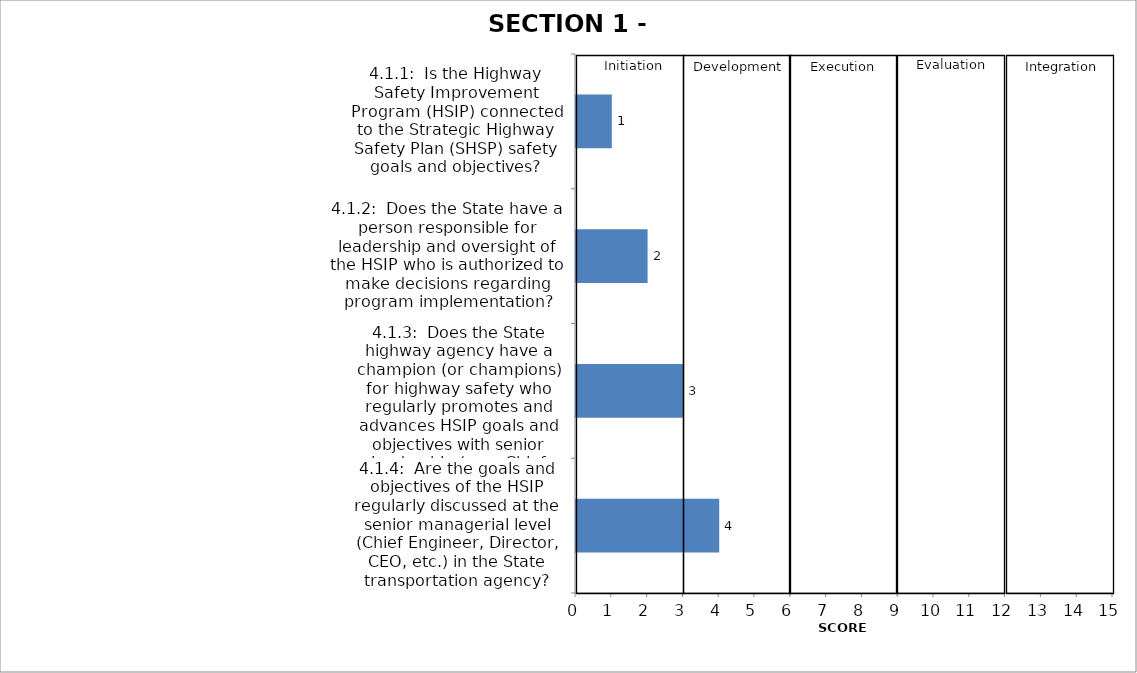
| Category | Series 0 |
|---|---|
| 4.1.1:  Is the Highway Safety Improvement Program (HSIP) connected to the Strategic Highway Safety Plan (SHSP) safety goals and objectives? | 1 |
| 4.1.2:  Does the State have a person responsible for leadership and oversight of the HSIP who is authorized to make decisions regarding program implementation? | 2 |
| 4.1.3:  Does the State highway agency have a champion (or champions) for highway safety who regularly promotes and advances HSIP goals and objectives with senior leadership (e.g., Chief Engineer, CEO, etc…) | 3 |
| 4.1.4:  Are the goals and objectives of the HSIP regularly discussed at the senior managerial level (Chief Engineer, Director, CEO, etc.) in the State transportation agency? | 4 |